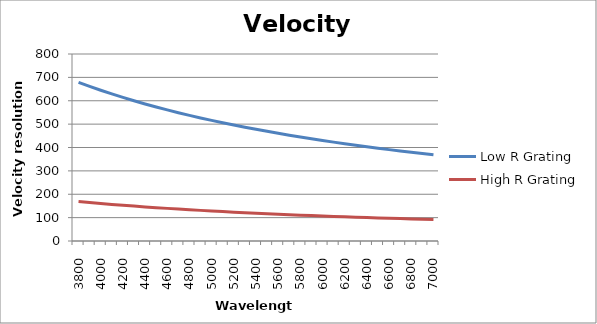
| Category | Low R Grating | High R Grating |
|---|---|---|
| 3800.0 | 678.947 | 168.947 |
| 3900.0 | 661.538 | 164.615 |
| 4000.0 | 645 | 160.5 |
| 4100.0 | 629.268 | 156.585 |
| 4200.0 | 614.286 | 152.857 |
| 4300.0 | 600 | 149.302 |
| 4400.0 | 586.364 | 145.909 |
| 4500.0 | 573.333 | 142.667 |
| 4600.0 | 560.87 | 139.565 |
| 4700.0 | 548.936 | 136.596 |
| 4800.0 | 537.5 | 133.75 |
| 4900.0 | 526.531 | 131.02 |
| 5000.0 | 516 | 128.4 |
| 5100.0 | 505.882 | 125.882 |
| 5200.0 | 496.154 | 123.462 |
| 5300.0 | 486.792 | 121.132 |
| 5400.0 | 477.778 | 118.889 |
| 5500.0 | 469.091 | 116.727 |
| 5600.0 | 460.714 | 114.643 |
| 5700.0 | 452.632 | 112.632 |
| 5800.0 | 444.828 | 110.69 |
| 5900.0 | 437.288 | 108.814 |
| 6000.0 | 430 | 107 |
| 6100.0 | 422.951 | 105.246 |
| 6200.0 | 416.129 | 103.548 |
| 6300.0 | 409.524 | 101.905 |
| 6400.0 | 403.125 | 100.313 |
| 6500.0 | 396.923 | 98.769 |
| 6600.0 | 390.909 | 97.273 |
| 6700.0 | 385.075 | 95.821 |
| 6800.0 | 379.412 | 94.412 |
| 6900.0 | 373.913 | 93.043 |
| 7000.0 | 368.571 | 91.714 |